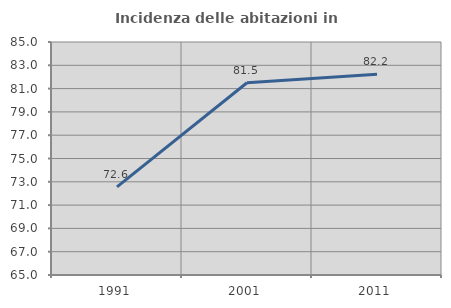
| Category | Incidenza delle abitazioni in proprietà  |
|---|---|
| 1991.0 | 72.564 |
| 2001.0 | 81.499 |
| 2011.0 | 82.227 |